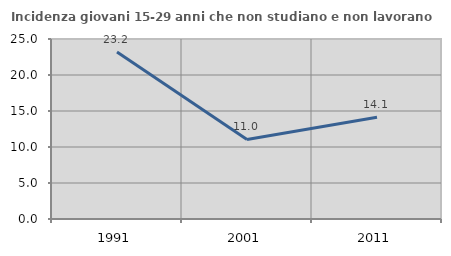
| Category | Incidenza giovani 15-29 anni che non studiano e non lavorano  |
|---|---|
| 1991.0 | 23.2 |
| 2001.0 | 11.045 |
| 2011.0 | 14.14 |